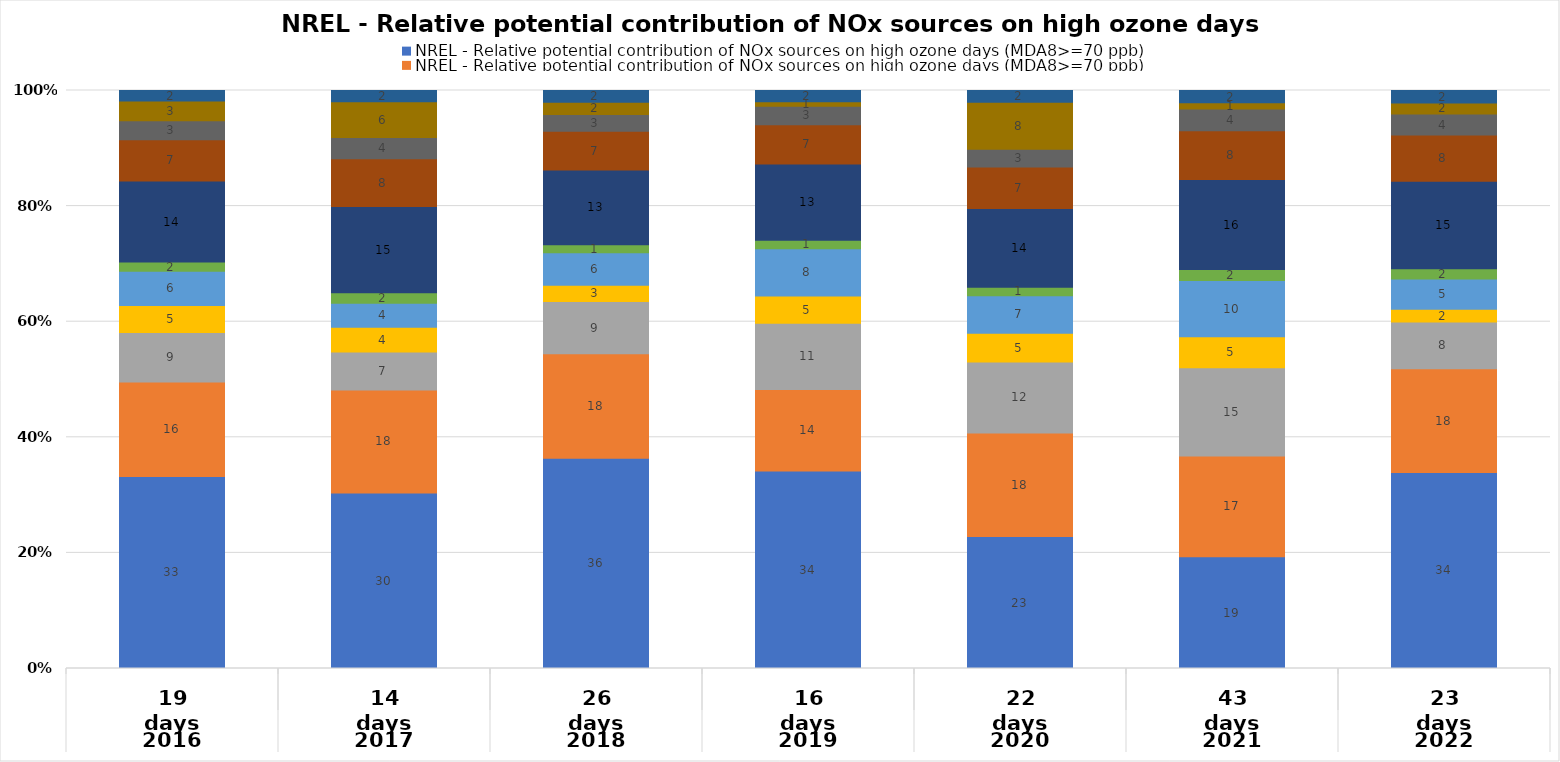
| Category | EGU Point | Non-EGU Point | O&G Area | O&G Point | O&G pre-production | Nonpoint | On-road Mobile | Other Non-road Mobile | Lawn & Garden Equipment | Airports | Rail |
|---|---|---|---|---|---|---|---|---|---|---|---|
| 0 | 33.228 | 16.325 | 8.575 | 4.677 | 5.93 | 1.601 | 13.992 | 7.146 | 3.297 | 3.392 | 1.836 |
| 1 | 30.356 | 17.841 | 6.56 | 4.275 | 4.157 | 1.808 | 14.927 | 8.263 | 3.683 | 6.202 | 1.927 |
| 2 | 36.382 | 18.094 | 9.006 | 2.84 | 5.616 | 1.37 | 12.929 | 6.715 | 2.911 | 2.098 | 2.038 |
| 3 | 34.167 | 14.103 | 11.44 | 4.741 | 8.179 | 1.458 | 13.191 | 6.811 | 3.188 | 0.763 | 1.959 |
| 4 | 22.826 | 17.938 | 12.283 | 4.938 | 6.522 | 1.465 | 13.599 | 7.189 | 3.091 | 8.106 | 2.042 |
| 5 | 19.341 | 17.441 | 15.246 | 5.389 | 9.709 | 1.893 | 15.579 | 8.42 | 3.795 | 1.07 | 2.116 |
| 6 | 33.911 | 17.93 | 8.088 | 2.236 | 5.201 | 1.787 | 15.167 | 7.966 | 3.657 | 1.886 | 2.17 |